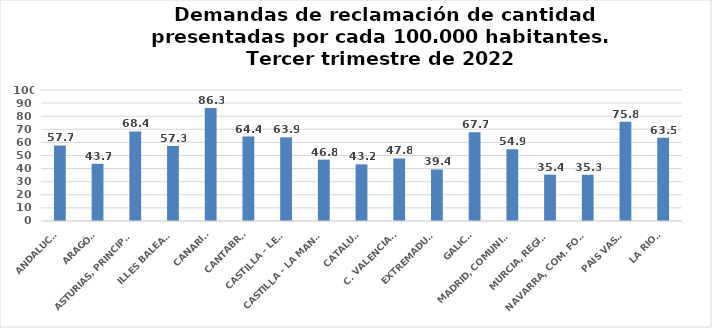
| Category | Series 0 |
|---|---|
| ANDALUCÍA | 57.701 |
| ARAGÓN | 43.687 |
| ASTURIAS, PRINCIPADO | 68.392 |
| ILLES BALEARS | 57.301 |
| CANARIAS | 86.289 |
| CANTABRIA | 64.42 |
| CASTILLA - LEÓN | 63.88 |
| CASTILLA - LA MANCHA | 46.828 |
| CATALUÑA | 43.234 |
| C. VALENCIANA | 47.752 |
| EXTREMADURA | 39.365 |
| GALICIA | 67.679 |
| MADRID, COMUNIDAD | 54.86 |
| MURCIA, REGIÓN | 35.392 |
| NAVARRA, COM. FORAL | 35.262 |
| PAÍS VASCO | 75.752 |
| LA RIOJA | 63.54 |